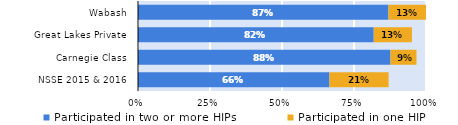
| Category | Participated in two or more HIPs | Participated in one HIP |
|---|---|---|
| NSSE 2015 & 2016 | 0.665 | 0.205 |
| Carnegie Class | 0.877 | 0.09 |
| Great Lakes Private | 0.819 | 0.133 |
| Wabash | 0.87 | 0.13 |